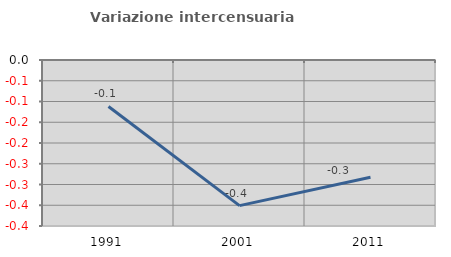
| Category | Variazione intercensuaria annua |
|---|---|
| 1991.0 | -0.112 |
| 2001.0 | -0.351 |
| 2011.0 | -0.283 |